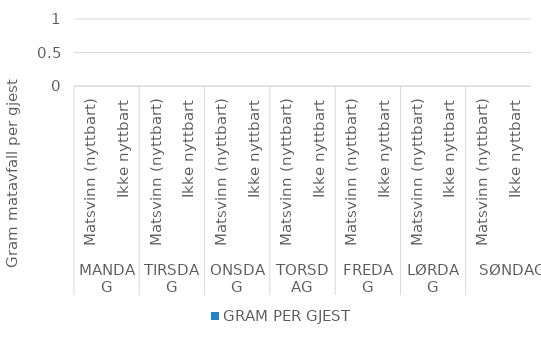
| Category |  GRAM PER GJEST  |
|---|---|
| 0 | 0 |
| 1 | 0 |
| 2 | 0 |
| 3 | 0 |
| 4 | 0 |
| 5 | 0 |
| 6 | 0 |
| 7 | 0 |
| 8 | 0 |
| 9 | 0 |
| 10 | 0 |
| 11 | 0 |
| 12 | 0 |
| 13 | 0 |